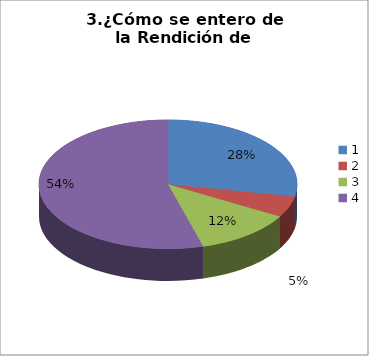
| Category | Series 0 |
|---|---|
| 0 | 16 |
| 1 | 3 |
| 2 | 7 |
| 3 | 31 |